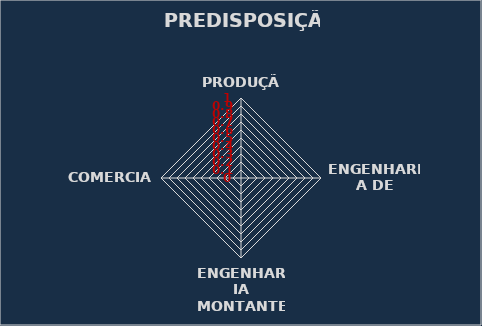
| Category | Series 0 |
|---|---|
| PRODUÇÃO | 0 |
| ENGENHARIA DE CUSTO | 0 |
| ENGENHARIA MONTANTE | 0 |
| COMERCIAL | 0 |